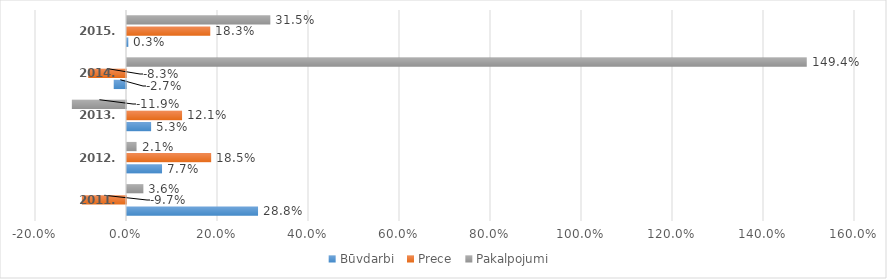
| Category | Būvdarbi | Prece | Pakalpojumi |
|---|---|---|---|
| 2011. gads | 0.288 | -0.097 | 0.036 |
| 2012. gads | 0.077 | 0.185 | 0.021 |
| 2013. gads | 0.053 | 0.121 | -0.119 |
| 2014. gads | -0.027 | -0.083 | 1.494 |
| 2015. gads | 0.003 | 0.183 | 0.315 |